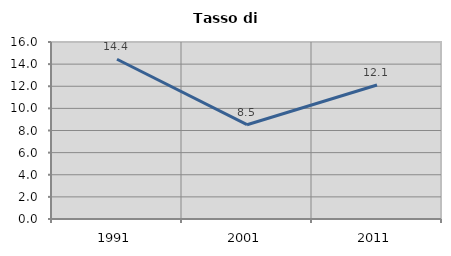
| Category | Tasso di disoccupazione   |
|---|---|
| 1991.0 | 14.439 |
| 2001.0 | 8.524 |
| 2011.0 | 12.115 |